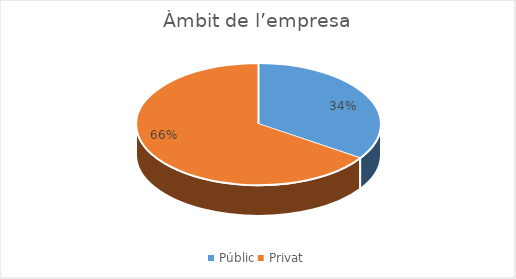
| Category | Series 0 |
|---|---|
| Públic | 31 |
| Privat | 59 |